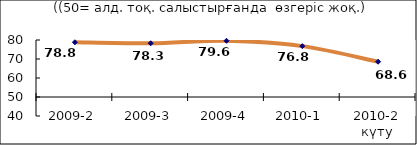
| Category | Диф.индекс ↓ |
|---|---|
| 2009-2 | 78.795 |
| 2009-3 | 78.28 |
| 2009-4 | 79.6 |
| 2010-1 | 76.775 |
| 2010-2 күту | 68.58 |